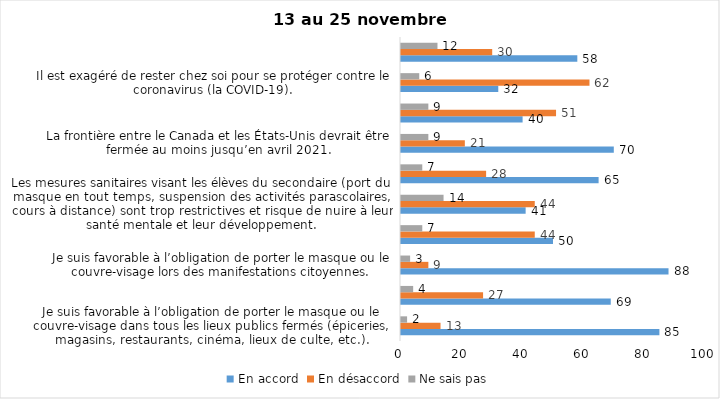
| Category | En accord | En désaccord | Ne sais pas |
|---|---|---|---|
| Je suis favorable à l’obligation de porter le masque ou le couvre-visage dans tous les lieux publics fermés (épiceries, magasins, restaurants, cinéma, lieux de culte, etc.). | 85 | 13 | 2 |
| C’est une bonne chose que les policiers puissent donner facilement des contraventions aux gens qui ne respectent pas les mesures pour prévenir le coronavirus (la COVID-19). | 69 | 27 | 4 |
| Je suis favorable à l’obligation de porter le masque ou le couvre-visage lors des manifestations citoyennes. | 88 | 9 | 3 |
| C’est une bonne chose d’arrêter les activités sportives de groupe (ex. hockey, soccer, yoga, etc.) et de fermer les centres d’entraînement (gyms) dans les zones rouges. | 50 | 44 | 7 |
| Les mesures sanitaires visant les élèves du secondaire (port du masque en tout temps, suspension des activités parascolaires, cours à distance) sont trop restrictives et risque de nuire à leur santé mentale et leur développement. | 41 | 44 | 14 |
| Je suis favorable à l’obligation de porter le masque ou le couvre-visage en tout temps pour les élèves au secondaire. | 65 | 28 | 7 |
| La frontière entre le Canada et les États-Unis devrait être fermée au moins jusqu’en avril 2021. | 70 | 21 | 9 |
| Le gouvernement et les médias exagèrent par rapport au coronavirus (la COVID-19). | 40 | 51 | 9 |
| Il est exagéré de rester chez soi pour se protéger contre le coronavirus (la COVID-19). | 32 | 62 | 6 |
| Les jeunes ne respectent pas les règles de confinement et contribuent à propager la COVID-19. | 58 | 30 | 12 |